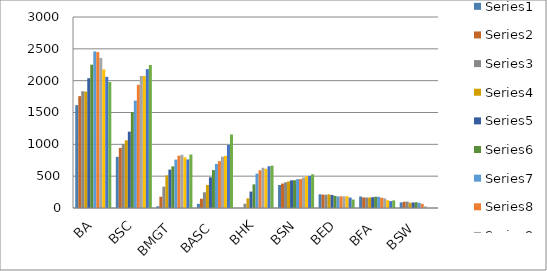
| Category | Series 0 | Series 1 | Series 2 | Series 3 | Series 4 | Series 5 | Series 6 | Series 7 | Series 8 | Series 9 | Series 10 | Series 11 |
|---|---|---|---|---|---|---|---|---|---|---|---|---|
| BA | 1616 | 1757 | 1834 | 1828 | 2038 | 2251 | 2459 | 2448 | 2357 | 2176 | 2060 | 1979 |
| BSC | 803 | 944 | 1007 | 1063 | 1199 | 1508 | 1687 | 1935 | 2073 | 2074 | 2181 | 2246 |
| BMGT | 27 | 177 | 335 | 512 | 603 | 654 | 760 | 821 | 836 | 796 | 763 | 840 |
| BASC | 65 | 145 | 247 | 361 | 482 | 596 | 692 | 736 | 806 | 819 | 991 | 1155 |
| BHK | 0 | 0 | 67 | 152 | 258 | 371 | 540 | 593 | 632 | 616 | 656 | 665 |
| BSN | 361 | 384 | 404 | 418 | 435 | 436 | 453 | 454 | 479 | 498 | 504 | 529 |
| BED | 215 | 210 | 209 | 213 | 205 | 190 | 181 | 183 | 183 | 184 | 164 | 133 |
| BFA | 180 | 166 | 165 | 165 | 169 | 177 | 176 | 162 | 152 | 123 | 108 | 119 |
| BSW | 88 | 98 | 100 | 82 | 87 | 90 | 81 | 65 | 26 | 0 | 0 | 0 |